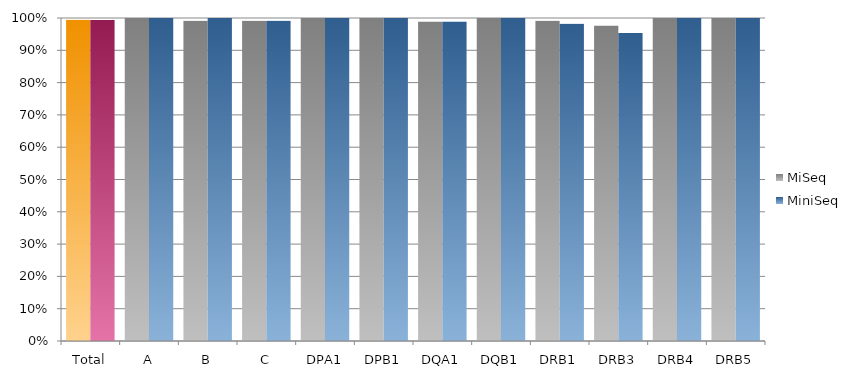
| Category | MiSeq | MiniSeq |
|---|---|---|
| Total | 0.995 | 0.994 |
| A | 1 | 1 |
| B | 0.992 | 1 |
| C | 0.992 | 0.992 |
| DPA1 | 1 | 1 |
| DPB1 | 1 | 1 |
| DQA1 | 0.989 | 0.989 |
| DQB1 | 1 | 1 |
| DRB1 | 0.991 | 0.982 |
| DRB3 | 0.977 | 0.953 |
| DRB4 | 1 | 1 |
| DRB5 | 1 | 1 |